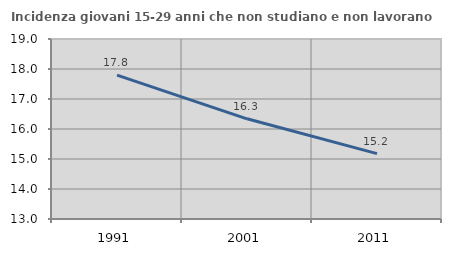
| Category | Incidenza giovani 15-29 anni che non studiano e non lavorano  |
|---|---|
| 1991.0 | 17.797 |
| 2001.0 | 16.34 |
| 2011.0 | 15.179 |